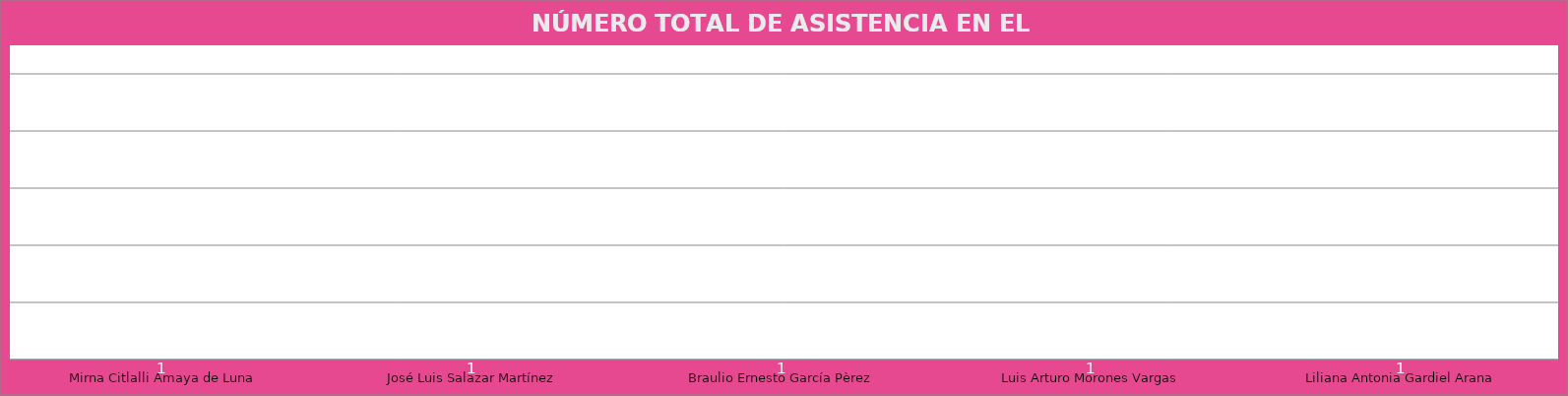
| Category | Mirna Citlalli Amaya de Luna |
|---|---|
| Mirna Citlalli Amaya de Luna | 1 |
| José Luis Salazar Martínez | 1 |
| Braulio Ernesto García Pèrez | 1 |
| Luis Arturo Morones Vargas | 1 |
| Liliana Antonia Gardiel Arana | 1 |